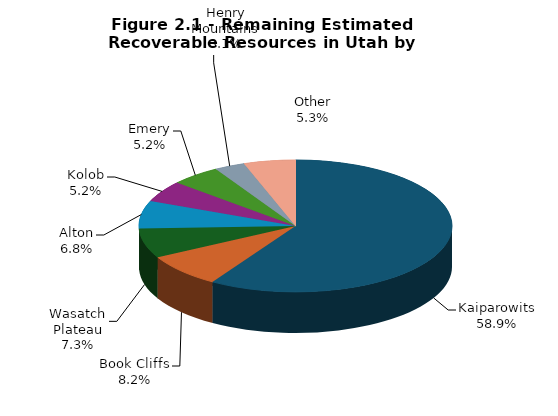
| Category | Series 0 |
|---|---|
| Kaiparowits | 0.589 |
| Book Cliffs | 0.082 |
| Wasatch Plateau | 0.073 |
| Alton | 0.068 |
| Kolob | 0.052 |
| Emery | 0.052 |
| Henry Mountains | 0.031 |
| Other | 0.053 |